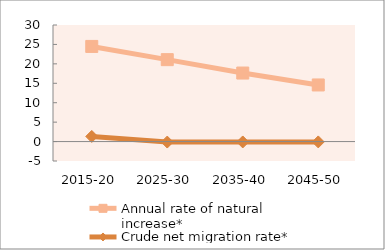
| Category | Annual rate of natural increase* | Crude net migration rate* |
|---|---|---|
| 2015-20 | 24.485 | 1.318 |
| 2025-30 | 21.082 | -0.124 |
| 2035-40 | 17.636 | -0.102 |
| 2045-50 | 14.568 | -0.087 |